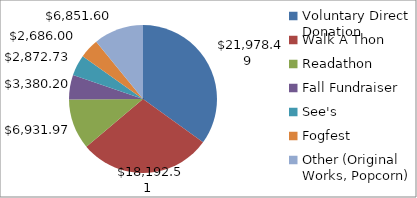
| Category | Series 0 | Series 1 |
|---|---|---|
| Voluntary Direct Donation | 21978.49 | 0.349 |
| Walk A Thon | 18192.51 | 0.289 |
| Readathon | 6931.97 | 0.11 |
| Fall Fundraiser | 3380.2 | 0.054 |
| See's | 2872.73 | 0.046 |
| Fogfest | 2686 | 0.043 |
| Other (Original Works, Popcorn) | 6851.595 | 0.109 |